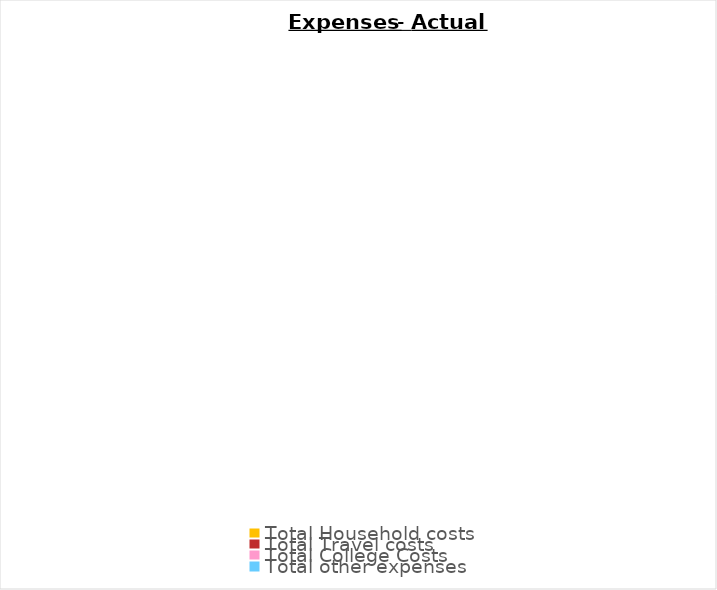
| Category | Series 0 |
|---|---|
| Total Household costs | 0 |
| Total Travel costs | 0 |
| Total College Costs | 0 |
| Total other expenses | 0 |